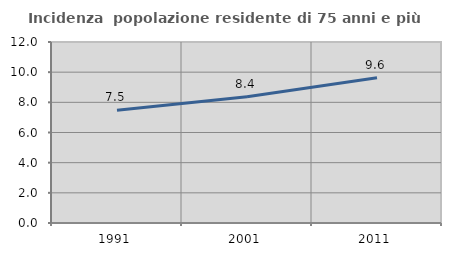
| Category | Incidenza  popolazione residente di 75 anni e più |
|---|---|
| 1991.0 | 7.47 |
| 2001.0 | 8.366 |
| 2011.0 | 9.628 |